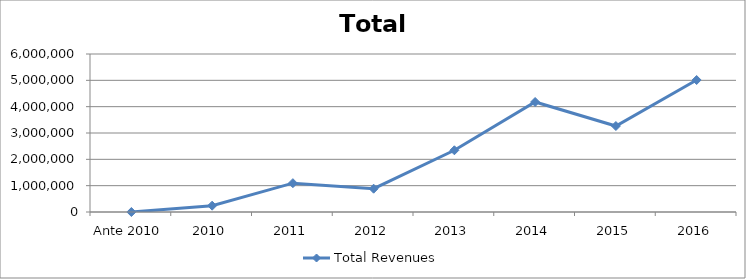
| Category | Total Revenues |
|---|---|
| Ante 2010 | 0 |
| 2010 | 240000 |
| 2011 | 1095000 |
| 2012 | 885000 |
| 2013 | 2343217.89 |
| 2014 | 4177426.357 |
| 2015 | 3264958 |
| 2016 | 5012617.263 |